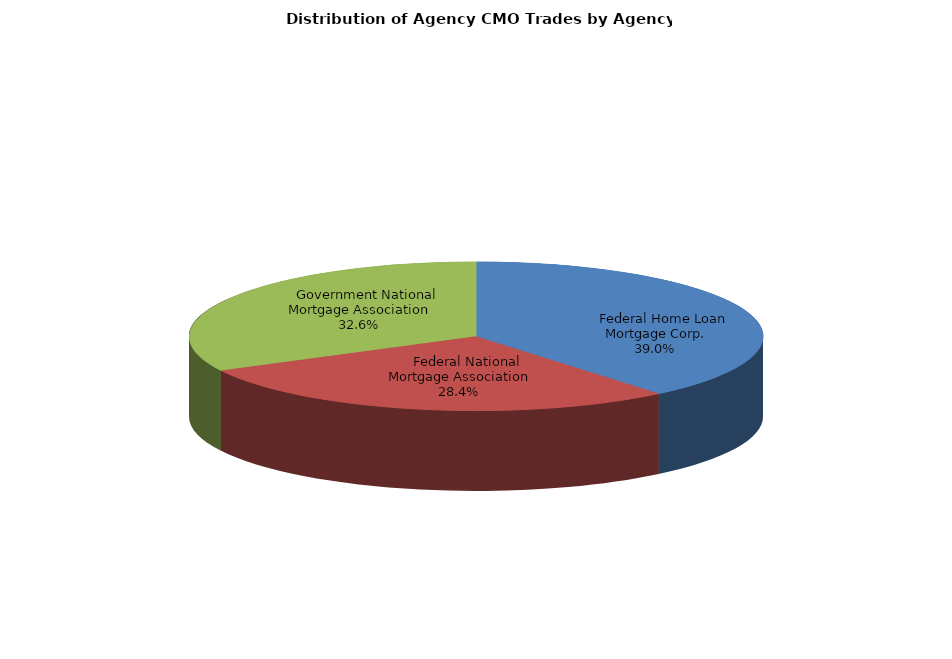
| Category | Series 0 |
|---|---|
|     Federal Home Loan Mortgage Corp. | 428.289 |
|     Federal National Mortgage Association | 311.435 |
|     Government National Mortgage Association | 357.68 |